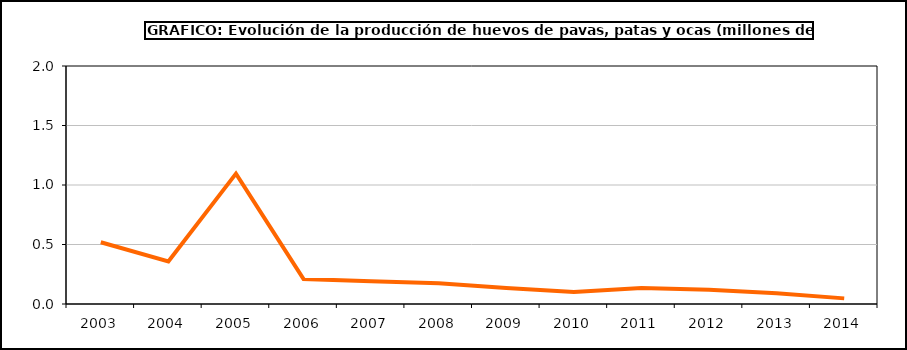
| Category | huevos |
|---|---|
| 2003.0 | 0.519 |
| 2004.0 | 0.358 |
| 2005.0 | 1.095 |
| 2006.0 | 0.209 |
| 2007.0 | 0.191 |
| 2008.0 | 0.174 |
| 2009.0 | 0.135 |
| 2010.0 | 0.1 |
| 2011.0 | 0.135 |
| 2012.0 | 0.119 |
| 2013.0 | 0.09 |
| 2014.0 | 0.047 |